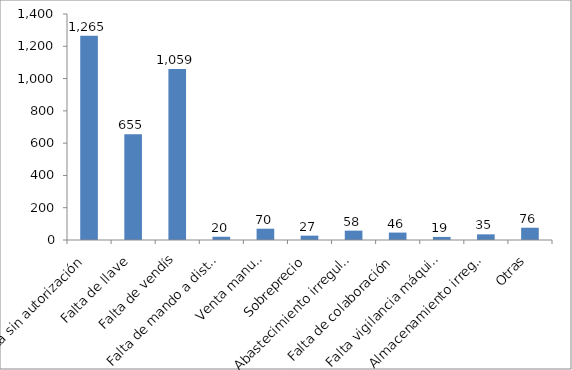
| Category | Expedientes iniciados en 2015 |
|---|---|
| Venta sin autorización | 1265 |
| Falta de llave | 655 |
| Falta de vendís | 1059 |
| Falta de mando a distancia | 20 |
| Venta manual | 70 |
| Sobreprecio | 27 |
| Abastecimiento irregular | 58 |
| Falta de colaboración | 46 |
| Falta vigilancia máquinas | 19 |
| Almacenamiento irregular | 35 |
| Otras | 76 |